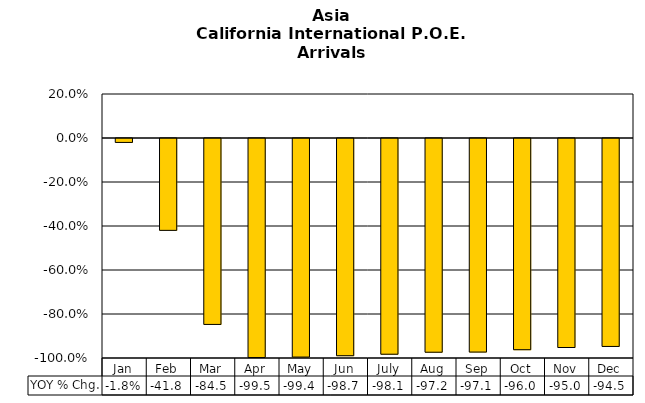
| Category | YOY % Chg. |
|---|---|
| Jan | -0.018 |
| Feb | -0.418 |
| Mar | -0.845 |
| Apr | -0.995 |
| May | -0.994 |
| Jun | -0.987 |
| July | -0.981 |
| Aug | -0.972 |
| Sep | -0.971 |
| Oct | -0.96 |
| Nov | -0.95 |
| Dec | -0.945 |